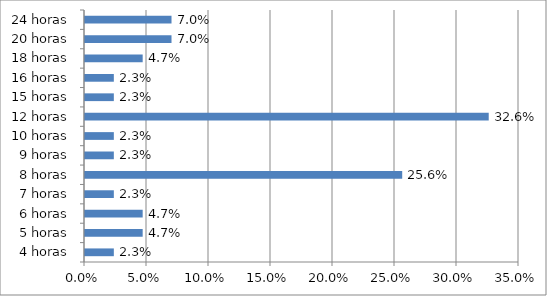
| Category | Series 0 |
|---|---|
| 4 horas | 0.023 |
| 5 horas | 0.047 |
| 6 horas | 0.047 |
| 7 horas | 0.023 |
| 8 horas | 0.256 |
| 9 horas | 0.023 |
| 10 horas | 0.023 |
| 12 horas | 0.326 |
| 15 horas | 0.023 |
| 16 horas | 0.023 |
| 18 horas | 0.047 |
| 20 horas | 0.07 |
| 24 horas | 0.07 |